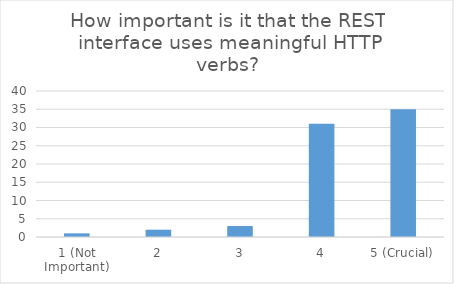
| Category | How important is it that the REST interface uses meaningful HTTP verbs? |
|---|---|
| 1 (Not Important) | 1 |
| 2 | 2 |
| 3 | 3 |
| 4 | 31 |
| 5 (Crucial) | 35 |